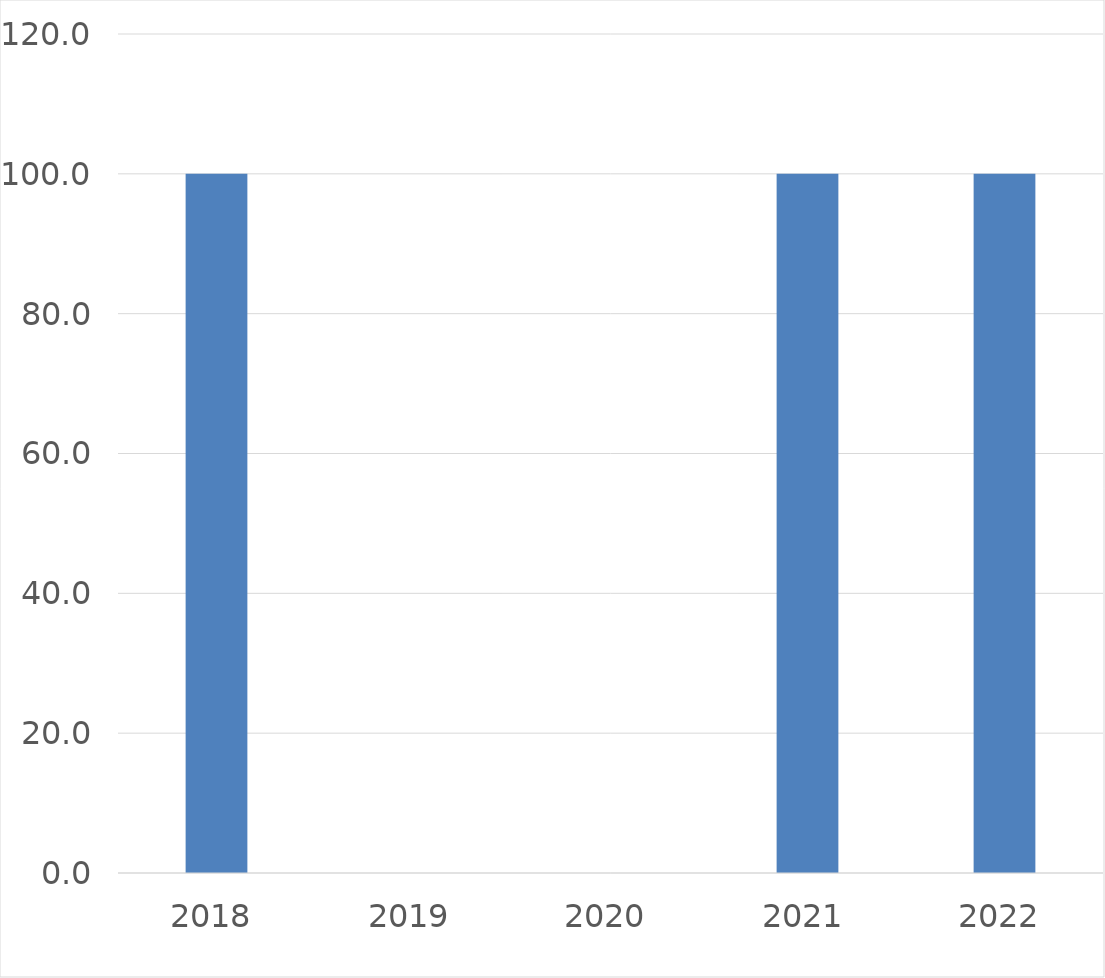
| Category | Series 0 |
|---|---|
| 2018 | 100 |
| 2019 | 0 |
| 2020 | 0 |
| 2021 | 100 |
| 2022 | 100 |